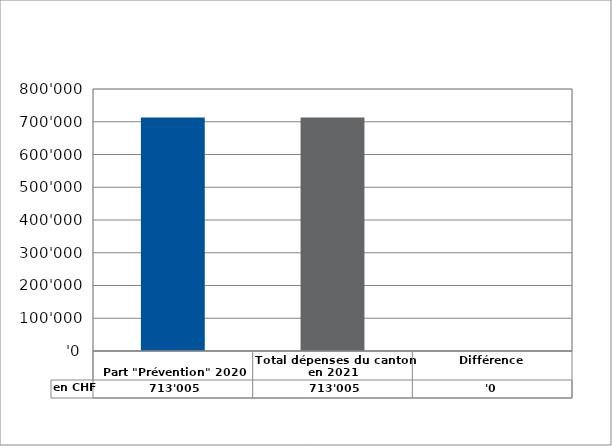
| Category | en CHF |
|---|---|
| 
Part "Prévention" 2020

 | 713005 |
| Total dépenses du canton en 2021 | 713005 |
| Différence | 0 |